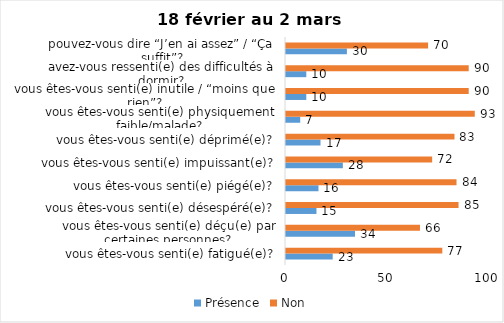
| Category | Présence | Non |
|---|---|---|
| vous êtes-vous senti(e) fatigué(e)? | 23 | 77 |
| vous êtes-vous senti(e) déçu(e) par certaines personnes? | 34 | 66 |
| vous êtes-vous senti(e) désespéré(e)? | 15 | 85 |
| vous êtes-vous senti(e) piégé(e)? | 16 | 84 |
| vous êtes-vous senti(e) impuissant(e)? | 28 | 72 |
| vous êtes-vous senti(e) déprimé(e)? | 17 | 83 |
| vous êtes-vous senti(e) physiquement faible/malade? | 7 | 93 |
| vous êtes-vous senti(e) inutile / “moins que rien”? | 10 | 90 |
| avez-vous ressenti(e) des difficultés à dormir? | 10 | 90 |
| pouvez-vous dire “J’en ai assez” / “Ça suffit”? | 30 | 70 |